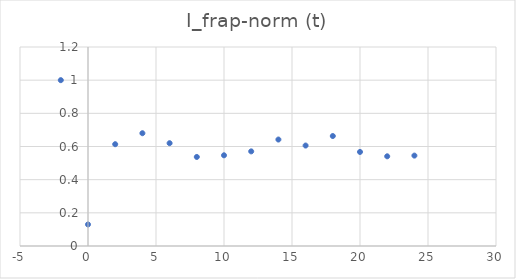
| Category | I_frap-norm (t) |
|---|---|
| -2.0 | 1 |
| 0.0 | 0.13 |
| 2.0 | 0.614 |
| 4.0 | 0.68 |
| 6.0 | 0.62 |
| 8.0 | 0.537 |
| 10.0 | 0.547 |
| 12.0 | 0.571 |
| 14.0 | 0.642 |
| 16.0 | 0.606 |
| 18.0 | 0.663 |
| 20.0 | 0.567 |
| 22.0 | 0.541 |
| 24.0 | 0.545 |